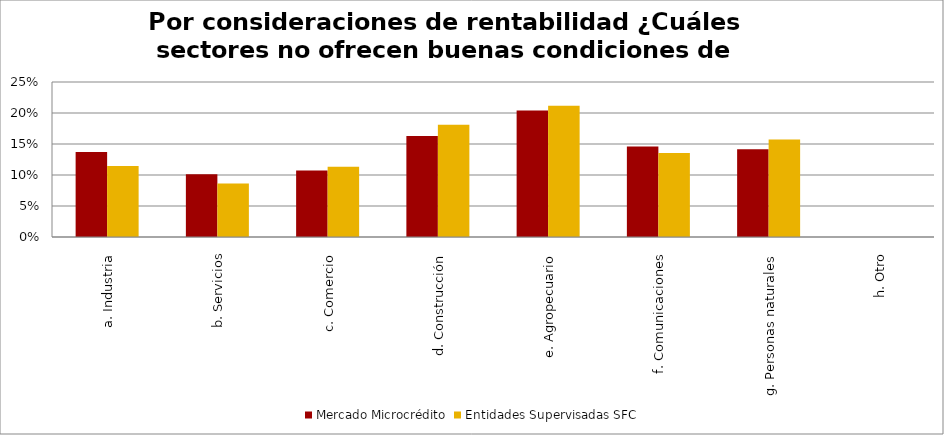
| Category | Mercado Microcrédito | Entidades Supervisadas SFC |
|---|---|---|
| a. Industria | 0.137 | 0.114 |
| b. Servicios | 0.101 | 0.086 |
| c. Comercio | 0.107 | 0.113 |
| d. Construcción | 0.163 | 0.181 |
| e. Agropecuario | 0.204 | 0.212 |
| f. Comunicaciones | 0.146 | 0.136 |
| g. Personas naturales | 0.142 | 0.157 |
| h. Otro | 0 | 0 |